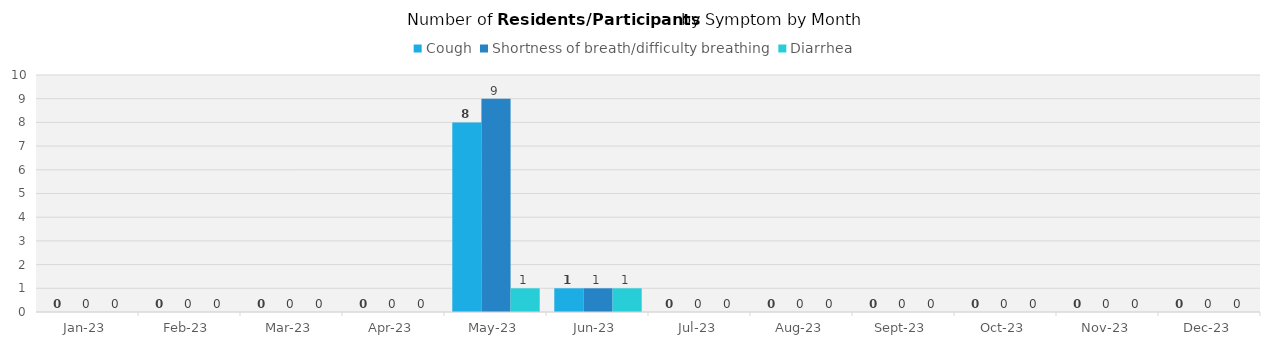
| Category | Cough | Shortness of breath/difficulty breathing | Diarrhea |
|---|---|---|---|
| 2023-01-01 | 0 | 0 | 0 |
| 2023-02-01 | 0 | 0 | 0 |
| 2023-03-01 | 0 | 0 | 0 |
| 2023-04-01 | 0 | 0 | 0 |
| 2023-05-01 | 8 | 9 | 1 |
| 2023-06-01 | 1 | 1 | 1 |
| 2023-07-01 | 0 | 0 | 0 |
| 2023-08-01 | 0 | 0 | 0 |
| 2023-09-01 | 0 | 0 | 0 |
| 2023-10-01 | 0 | 0 | 0 |
| 2023-11-01 | 0 | 0 | 0 |
| 2023-12-01 | 0 | 0 | 0 |